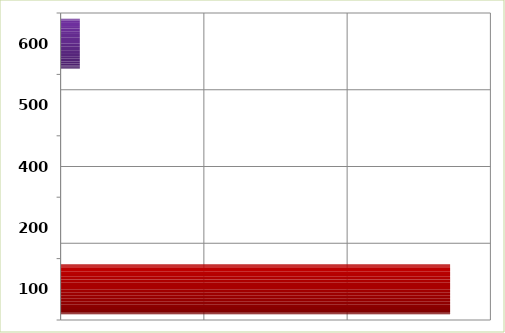
| Category | Series 0 |
|---|---|
| 100.0 | 5437668 |
| 200.0 | 0 |
| 400.0 | 0 |
| 500.0 | 0 |
| 600.0 | 268532 |